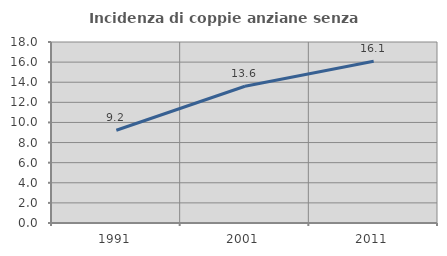
| Category | Incidenza di coppie anziane senza figli  |
|---|---|
| 1991.0 | 9.222 |
| 2001.0 | 13.598 |
| 2011.0 | 16.076 |